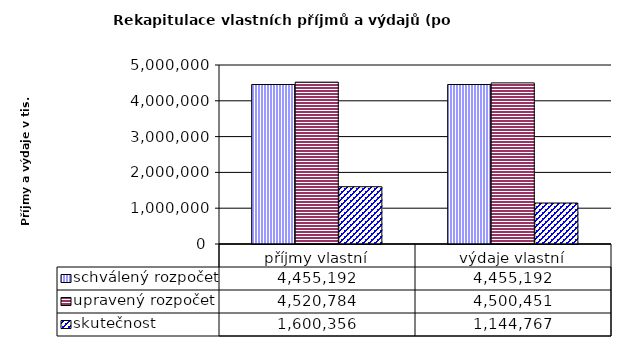
| Category | schválený rozpočet | upravený rozpočet | skutečnost |
|---|---|---|---|
| příjmy vlastní | 4455192 | 4520784 | 1600356 |
| výdaje vlastní | 4455192 | 4500451 | 1144767 |